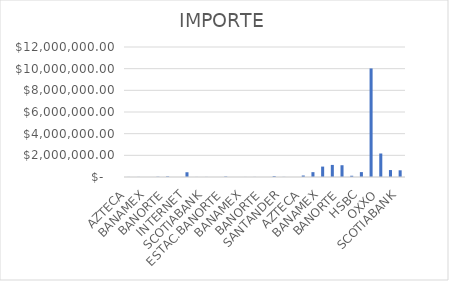
| Category | IMPORTE |
|---|---|
| AZTECA | 6742.49 |
| BAJIO | 7320.61 |
| BANAMEX | 2637.69 |
| BANCOMER | 23400.41 |
| BANORTE | 54280.75 |
| HSBC | 2486.9 |
| INTERNET | 439077.33 |
| SANTANDER | 5701.07 |
| SCOTIABANK | 7627.04 |
| OXXO | 872 |
| ESTAC.BANORTE | 42768 |
| AZTECA | 278 |
| BANAMEX | 4725.76 |
| BANCOMER | 8318.76 |
| BANORTE | 834 |
| INTERNET | 81195.82 |
| SANTANDER | 11080 |
| SCOTIABANK | 834 |
| AZTECA | 137050.75 |
| BAJIO | 447384.35 |
| BANAMEX | 961029.13 |
| BANCOMER | 1115041.51 |
| BANORTE | 1086578.47 |
| BANREGIO | 115392.96 |
| HSBC | 451787.03 |
| INTERNET | 10021652.21 |
| OXXO | 2169678.83 |
| SANTANDER | 640964.4 |
| SCOTIABANK | 618884.83 |